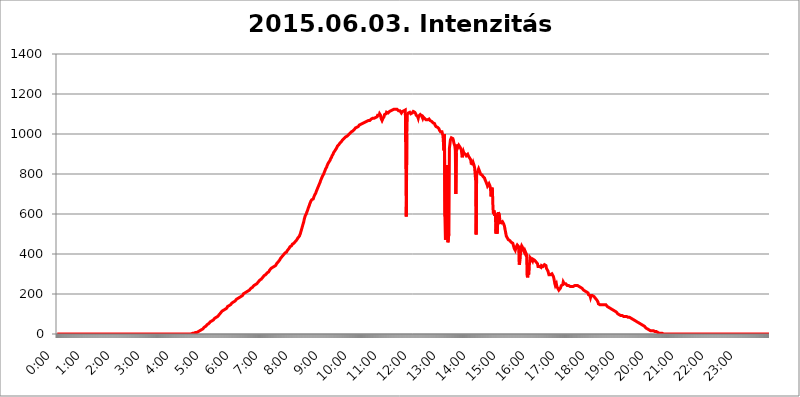
| Category | 2015.06.03. Intenzitás [W/m^2] |
|---|---|
| 0.0 | 0 |
| 0.0006944444444444445 | 0 |
| 0.001388888888888889 | 0 |
| 0.0020833333333333333 | 0 |
| 0.002777777777777778 | 0 |
| 0.003472222222222222 | 0 |
| 0.004166666666666667 | 0 |
| 0.004861111111111111 | 0 |
| 0.005555555555555556 | 0 |
| 0.0062499999999999995 | 0 |
| 0.006944444444444444 | 0 |
| 0.007638888888888889 | 0 |
| 0.008333333333333333 | 0 |
| 0.009027777777777779 | 0 |
| 0.009722222222222222 | 0 |
| 0.010416666666666666 | 0 |
| 0.011111111111111112 | 0 |
| 0.011805555555555555 | 0 |
| 0.012499999999999999 | 0 |
| 0.013194444444444444 | 0 |
| 0.013888888888888888 | 0 |
| 0.014583333333333332 | 0 |
| 0.015277777777777777 | 0 |
| 0.015972222222222224 | 0 |
| 0.016666666666666666 | 0 |
| 0.017361111111111112 | 0 |
| 0.018055555555555557 | 0 |
| 0.01875 | 0 |
| 0.019444444444444445 | 0 |
| 0.02013888888888889 | 0 |
| 0.020833333333333332 | 0 |
| 0.02152777777777778 | 0 |
| 0.022222222222222223 | 0 |
| 0.02291666666666667 | 0 |
| 0.02361111111111111 | 0 |
| 0.024305555555555556 | 0 |
| 0.024999999999999998 | 0 |
| 0.025694444444444447 | 0 |
| 0.02638888888888889 | 0 |
| 0.027083333333333334 | 0 |
| 0.027777777777777776 | 0 |
| 0.02847222222222222 | 0 |
| 0.029166666666666664 | 0 |
| 0.029861111111111113 | 0 |
| 0.030555555555555555 | 0 |
| 0.03125 | 0 |
| 0.03194444444444445 | 0 |
| 0.03263888888888889 | 0 |
| 0.03333333333333333 | 0 |
| 0.034027777777777775 | 0 |
| 0.034722222222222224 | 0 |
| 0.035416666666666666 | 0 |
| 0.036111111111111115 | 0 |
| 0.03680555555555556 | 0 |
| 0.0375 | 0 |
| 0.03819444444444444 | 0 |
| 0.03888888888888889 | 0 |
| 0.03958333333333333 | 0 |
| 0.04027777777777778 | 0 |
| 0.04097222222222222 | 0 |
| 0.041666666666666664 | 0 |
| 0.042361111111111106 | 0 |
| 0.04305555555555556 | 0 |
| 0.043750000000000004 | 0 |
| 0.044444444444444446 | 0 |
| 0.04513888888888889 | 0 |
| 0.04583333333333334 | 0 |
| 0.04652777777777778 | 0 |
| 0.04722222222222222 | 0 |
| 0.04791666666666666 | 0 |
| 0.04861111111111111 | 0 |
| 0.049305555555555554 | 0 |
| 0.049999999999999996 | 0 |
| 0.05069444444444445 | 0 |
| 0.051388888888888894 | 0 |
| 0.052083333333333336 | 0 |
| 0.05277777777777778 | 0 |
| 0.05347222222222222 | 0 |
| 0.05416666666666667 | 0 |
| 0.05486111111111111 | 0 |
| 0.05555555555555555 | 0 |
| 0.05625 | 0 |
| 0.05694444444444444 | 0 |
| 0.057638888888888885 | 0 |
| 0.05833333333333333 | 0 |
| 0.05902777777777778 | 0 |
| 0.059722222222222225 | 0 |
| 0.06041666666666667 | 0 |
| 0.061111111111111116 | 0 |
| 0.06180555555555556 | 0 |
| 0.0625 | 0 |
| 0.06319444444444444 | 0 |
| 0.06388888888888888 | 0 |
| 0.06458333333333334 | 0 |
| 0.06527777777777778 | 0 |
| 0.06597222222222222 | 0 |
| 0.06666666666666667 | 0 |
| 0.06736111111111111 | 0 |
| 0.06805555555555555 | 0 |
| 0.06874999999999999 | 0 |
| 0.06944444444444443 | 0 |
| 0.07013888888888889 | 0 |
| 0.07083333333333333 | 0 |
| 0.07152777777777779 | 0 |
| 0.07222222222222223 | 0 |
| 0.07291666666666667 | 0 |
| 0.07361111111111111 | 0 |
| 0.07430555555555556 | 0 |
| 0.075 | 0 |
| 0.07569444444444444 | 0 |
| 0.0763888888888889 | 0 |
| 0.07708333333333334 | 0 |
| 0.07777777777777778 | 0 |
| 0.07847222222222222 | 0 |
| 0.07916666666666666 | 0 |
| 0.0798611111111111 | 0 |
| 0.08055555555555556 | 0 |
| 0.08125 | 0 |
| 0.08194444444444444 | 0 |
| 0.08263888888888889 | 0 |
| 0.08333333333333333 | 0 |
| 0.08402777777777777 | 0 |
| 0.08472222222222221 | 0 |
| 0.08541666666666665 | 0 |
| 0.08611111111111112 | 0 |
| 0.08680555555555557 | 0 |
| 0.08750000000000001 | 0 |
| 0.08819444444444445 | 0 |
| 0.08888888888888889 | 0 |
| 0.08958333333333333 | 0 |
| 0.09027777777777778 | 0 |
| 0.09097222222222222 | 0 |
| 0.09166666666666667 | 0 |
| 0.09236111111111112 | 0 |
| 0.09305555555555556 | 0 |
| 0.09375 | 0 |
| 0.09444444444444444 | 0 |
| 0.09513888888888888 | 0 |
| 0.09583333333333333 | 0 |
| 0.09652777777777777 | 0 |
| 0.09722222222222222 | 0 |
| 0.09791666666666667 | 0 |
| 0.09861111111111111 | 0 |
| 0.09930555555555555 | 0 |
| 0.09999999999999999 | 0 |
| 0.10069444444444443 | 0 |
| 0.1013888888888889 | 0 |
| 0.10208333333333335 | 0 |
| 0.10277777777777779 | 0 |
| 0.10347222222222223 | 0 |
| 0.10416666666666667 | 0 |
| 0.10486111111111111 | 0 |
| 0.10555555555555556 | 0 |
| 0.10625 | 0 |
| 0.10694444444444444 | 0 |
| 0.1076388888888889 | 0 |
| 0.10833333333333334 | 0 |
| 0.10902777777777778 | 0 |
| 0.10972222222222222 | 0 |
| 0.1111111111111111 | 0 |
| 0.11180555555555556 | 0 |
| 0.11180555555555556 | 0 |
| 0.1125 | 0 |
| 0.11319444444444444 | 0 |
| 0.11388888888888889 | 0 |
| 0.11458333333333333 | 0 |
| 0.11527777777777777 | 0 |
| 0.11597222222222221 | 0 |
| 0.11666666666666665 | 0 |
| 0.1173611111111111 | 0 |
| 0.11805555555555557 | 0 |
| 0.11944444444444445 | 0 |
| 0.12013888888888889 | 0 |
| 0.12083333333333333 | 0 |
| 0.12152777777777778 | 0 |
| 0.12222222222222223 | 0 |
| 0.12291666666666667 | 0 |
| 0.12291666666666667 | 0 |
| 0.12361111111111112 | 0 |
| 0.12430555555555556 | 0 |
| 0.125 | 0 |
| 0.12569444444444444 | 0 |
| 0.12638888888888888 | 0 |
| 0.12708333333333333 | 0 |
| 0.16875 | 0 |
| 0.12847222222222224 | 0 |
| 0.12916666666666668 | 0 |
| 0.12986111111111112 | 0 |
| 0.13055555555555556 | 0 |
| 0.13125 | 0 |
| 0.13194444444444445 | 0 |
| 0.1326388888888889 | 0 |
| 0.13333333333333333 | 0 |
| 0.13402777777777777 | 0 |
| 0.13402777777777777 | 0 |
| 0.13472222222222222 | 0 |
| 0.13541666666666666 | 0 |
| 0.1361111111111111 | 0 |
| 0.13749999999999998 | 0 |
| 0.13819444444444443 | 0 |
| 0.1388888888888889 | 0 |
| 0.13958333333333334 | 0 |
| 0.14027777777777778 | 0 |
| 0.14097222222222222 | 0 |
| 0.14166666666666666 | 0 |
| 0.1423611111111111 | 0 |
| 0.14305555555555557 | 0 |
| 0.14375000000000002 | 0 |
| 0.14444444444444446 | 0 |
| 0.1451388888888889 | 0 |
| 0.1451388888888889 | 0 |
| 0.14652777777777778 | 0 |
| 0.14722222222222223 | 0 |
| 0.14791666666666667 | 0 |
| 0.1486111111111111 | 0 |
| 0.14930555555555555 | 0 |
| 0.15 | 0 |
| 0.15069444444444444 | 0 |
| 0.15138888888888888 | 0 |
| 0.15208333333333332 | 0 |
| 0.15277777777777776 | 0 |
| 0.15347222222222223 | 0 |
| 0.15416666666666667 | 0 |
| 0.15486111111111112 | 0 |
| 0.15555555555555556 | 0 |
| 0.15625 | 0 |
| 0.15694444444444444 | 0 |
| 0.15763888888888888 | 0 |
| 0.15833333333333333 | 0 |
| 0.15902777777777777 | 0 |
| 0.15972222222222224 | 0 |
| 0.16041666666666668 | 0 |
| 0.16111111111111112 | 0 |
| 0.16180555555555556 | 0 |
| 0.1625 | 0 |
| 0.16319444444444445 | 0 |
| 0.1638888888888889 | 0 |
| 0.16458333333333333 | 0 |
| 0.16527777777777777 | 0 |
| 0.16597222222222222 | 0 |
| 0.16666666666666666 | 0 |
| 0.1673611111111111 | 0 |
| 0.16805555555555554 | 0 |
| 0.16874999999999998 | 0 |
| 0.16944444444444443 | 0 |
| 0.17013888888888887 | 0 |
| 0.1708333333333333 | 0 |
| 0.17152777777777775 | 0 |
| 0.17222222222222225 | 0 |
| 0.1729166666666667 | 0 |
| 0.17361111111111113 | 0 |
| 0.17430555555555557 | 0 |
| 0.17500000000000002 | 0 |
| 0.17569444444444446 | 0 |
| 0.1763888888888889 | 0 |
| 0.17708333333333334 | 0 |
| 0.17777777777777778 | 0 |
| 0.17847222222222223 | 0 |
| 0.17916666666666667 | 0 |
| 0.1798611111111111 | 0 |
| 0.18055555555555555 | 0 |
| 0.18125 | 0 |
| 0.18194444444444444 | 0 |
| 0.1826388888888889 | 0 |
| 0.18333333333333335 | 0 |
| 0.1840277777777778 | 0 |
| 0.18472222222222223 | 0 |
| 0.18541666666666667 | 0 |
| 0.18611111111111112 | 0 |
| 0.18680555555555556 | 0 |
| 0.1875 | 0 |
| 0.18819444444444444 | 3.525 |
| 0.18888888888888888 | 3.525 |
| 0.18958333333333333 | 3.525 |
| 0.19027777777777777 | 3.525 |
| 0.1909722222222222 | 3.525 |
| 0.19166666666666665 | 3.525 |
| 0.19236111111111112 | 3.525 |
| 0.19305555555555554 | 3.525 |
| 0.19375 | 7.887 |
| 0.19444444444444445 | 7.887 |
| 0.1951388888888889 | 7.887 |
| 0.19583333333333333 | 7.887 |
| 0.19652777777777777 | 12.257 |
| 0.19722222222222222 | 12.257 |
| 0.19791666666666666 | 12.257 |
| 0.1986111111111111 | 12.257 |
| 0.19930555555555554 | 12.257 |
| 0.19999999999999998 | 16.636 |
| 0.20069444444444443 | 16.636 |
| 0.20138888888888887 | 21.024 |
| 0.2020833333333333 | 21.024 |
| 0.2027777777777778 | 21.024 |
| 0.2034722222222222 | 25.419 |
| 0.2041666666666667 | 25.419 |
| 0.20486111111111113 | 29.823 |
| 0.20555555555555557 | 29.823 |
| 0.20625000000000002 | 34.234 |
| 0.20694444444444446 | 34.234 |
| 0.2076388888888889 | 38.653 |
| 0.20833333333333334 | 38.653 |
| 0.20902777777777778 | 43.079 |
| 0.20972222222222223 | 43.079 |
| 0.21041666666666667 | 47.511 |
| 0.2111111111111111 | 47.511 |
| 0.21180555555555555 | 51.951 |
| 0.2125 | 51.951 |
| 0.21319444444444444 | 56.398 |
| 0.2138888888888889 | 56.398 |
| 0.21458333333333335 | 60.85 |
| 0.2152777777777778 | 60.85 |
| 0.21597222222222223 | 65.31 |
| 0.21666666666666667 | 65.31 |
| 0.21736111111111112 | 65.31 |
| 0.21805555555555556 | 69.775 |
| 0.21875 | 69.775 |
| 0.21944444444444444 | 74.246 |
| 0.22013888888888888 | 74.246 |
| 0.22083333333333333 | 78.722 |
| 0.22152777777777777 | 78.722 |
| 0.2222222222222222 | 83.205 |
| 0.22291666666666665 | 83.205 |
| 0.2236111111111111 | 83.205 |
| 0.22430555555555556 | 87.692 |
| 0.225 | 87.692 |
| 0.22569444444444445 | 92.184 |
| 0.2263888888888889 | 92.184 |
| 0.22708333333333333 | 96.682 |
| 0.22777777777777777 | 101.184 |
| 0.22847222222222222 | 101.184 |
| 0.22916666666666666 | 105.69 |
| 0.2298611111111111 | 110.201 |
| 0.23055555555555554 | 110.201 |
| 0.23124999999999998 | 114.716 |
| 0.23194444444444443 | 114.716 |
| 0.23263888888888887 | 114.716 |
| 0.2333333333333333 | 119.235 |
| 0.2340277777777778 | 119.235 |
| 0.2347222222222222 | 123.758 |
| 0.2354166666666667 | 123.758 |
| 0.23611111111111113 | 128.284 |
| 0.23680555555555557 | 128.284 |
| 0.23750000000000002 | 128.284 |
| 0.23819444444444446 | 132.814 |
| 0.2388888888888889 | 137.347 |
| 0.23958333333333334 | 137.347 |
| 0.24027777777777778 | 137.347 |
| 0.24097222222222223 | 141.884 |
| 0.24166666666666667 | 141.884 |
| 0.2423611111111111 | 146.423 |
| 0.24305555555555555 | 146.423 |
| 0.24375 | 150.964 |
| 0.24444444444444446 | 150.964 |
| 0.24513888888888888 | 155.509 |
| 0.24583333333333335 | 155.509 |
| 0.2465277777777778 | 155.509 |
| 0.24722222222222223 | 160.056 |
| 0.24791666666666667 | 164.605 |
| 0.24861111111111112 | 164.605 |
| 0.24930555555555556 | 164.605 |
| 0.25 | 164.605 |
| 0.25069444444444444 | 169.156 |
| 0.2513888888888889 | 173.709 |
| 0.2520833333333333 | 173.709 |
| 0.25277777777777777 | 173.709 |
| 0.2534722222222222 | 178.264 |
| 0.25416666666666665 | 178.264 |
| 0.2548611111111111 | 182.82 |
| 0.2555555555555556 | 182.82 |
| 0.25625000000000003 | 182.82 |
| 0.2569444444444445 | 187.378 |
| 0.2576388888888889 | 187.378 |
| 0.25833333333333336 | 191.937 |
| 0.2590277777777778 | 191.937 |
| 0.25972222222222224 | 191.937 |
| 0.2604166666666667 | 196.497 |
| 0.2611111111111111 | 201.058 |
| 0.26180555555555557 | 201.058 |
| 0.2625 | 201.058 |
| 0.26319444444444445 | 205.62 |
| 0.2638888888888889 | 205.62 |
| 0.26458333333333334 | 210.182 |
| 0.2652777777777778 | 210.182 |
| 0.2659722222222222 | 214.746 |
| 0.26666666666666666 | 214.746 |
| 0.2673611111111111 | 214.746 |
| 0.26805555555555555 | 219.309 |
| 0.26875 | 219.309 |
| 0.26944444444444443 | 219.309 |
| 0.2701388888888889 | 223.873 |
| 0.2708333333333333 | 223.873 |
| 0.27152777777777776 | 228.436 |
| 0.2722222222222222 | 228.436 |
| 0.27291666666666664 | 233 |
| 0.2736111111111111 | 233 |
| 0.2743055555555555 | 237.564 |
| 0.27499999999999997 | 237.564 |
| 0.27569444444444446 | 242.127 |
| 0.27638888888888885 | 242.127 |
| 0.27708333333333335 | 246.689 |
| 0.2777777777777778 | 246.689 |
| 0.27847222222222223 | 251.251 |
| 0.2791666666666667 | 251.251 |
| 0.2798611111111111 | 251.251 |
| 0.28055555555555556 | 255.813 |
| 0.28125 | 255.813 |
| 0.28194444444444444 | 260.373 |
| 0.2826388888888889 | 260.373 |
| 0.2833333333333333 | 264.932 |
| 0.28402777777777777 | 269.49 |
| 0.2847222222222222 | 269.49 |
| 0.28541666666666665 | 269.49 |
| 0.28611111111111115 | 274.047 |
| 0.28680555555555554 | 274.047 |
| 0.28750000000000003 | 278.603 |
| 0.2881944444444445 | 283.156 |
| 0.2888888888888889 | 283.156 |
| 0.28958333333333336 | 287.709 |
| 0.2902777777777778 | 292.259 |
| 0.29097222222222224 | 292.259 |
| 0.2916666666666667 | 296.808 |
| 0.2923611111111111 | 296.808 |
| 0.29305555555555557 | 296.808 |
| 0.29375 | 301.354 |
| 0.29444444444444445 | 305.898 |
| 0.2951388888888889 | 305.898 |
| 0.29583333333333334 | 310.44 |
| 0.2965277777777778 | 310.44 |
| 0.2972222222222222 | 314.98 |
| 0.29791666666666666 | 319.517 |
| 0.2986111111111111 | 319.517 |
| 0.29930555555555555 | 324.052 |
| 0.3 | 328.584 |
| 0.30069444444444443 | 328.584 |
| 0.3013888888888889 | 328.584 |
| 0.3020833333333333 | 333.113 |
| 0.30277777777777776 | 333.113 |
| 0.3034722222222222 | 337.639 |
| 0.30416666666666664 | 337.639 |
| 0.3048611111111111 | 342.162 |
| 0.3055555555555555 | 342.162 |
| 0.30624999999999997 | 342.162 |
| 0.3069444444444444 | 346.682 |
| 0.3076388888888889 | 351.198 |
| 0.30833333333333335 | 351.198 |
| 0.3090277777777778 | 355.712 |
| 0.30972222222222223 | 360.221 |
| 0.3104166666666667 | 360.221 |
| 0.3111111111111111 | 364.728 |
| 0.31180555555555556 | 369.23 |
| 0.3125 | 373.729 |
| 0.31319444444444444 | 378.224 |
| 0.3138888888888889 | 378.224 |
| 0.3145833333333333 | 382.715 |
| 0.31527777777777777 | 387.202 |
| 0.3159722222222222 | 387.202 |
| 0.31666666666666665 | 391.685 |
| 0.31736111111111115 | 396.164 |
| 0.31805555555555554 | 400.638 |
| 0.31875000000000003 | 400.638 |
| 0.3194444444444445 | 405.108 |
| 0.3201388888888889 | 405.108 |
| 0.32083333333333336 | 409.574 |
| 0.3215277777777778 | 409.574 |
| 0.32222222222222224 | 414.035 |
| 0.3229166666666667 | 418.492 |
| 0.3236111111111111 | 422.943 |
| 0.32430555555555557 | 422.943 |
| 0.325 | 427.39 |
| 0.32569444444444445 | 431.833 |
| 0.3263888888888889 | 436.27 |
| 0.32708333333333334 | 436.27 |
| 0.3277777777777778 | 440.702 |
| 0.3284722222222222 | 440.702 |
| 0.32916666666666666 | 445.129 |
| 0.3298611111111111 | 449.551 |
| 0.33055555555555555 | 449.551 |
| 0.33125 | 449.551 |
| 0.33194444444444443 | 453.968 |
| 0.3326388888888889 | 458.38 |
| 0.3333333333333333 | 458.38 |
| 0.3340277777777778 | 462.786 |
| 0.3347222222222222 | 462.786 |
| 0.3354166666666667 | 467.187 |
| 0.3361111111111111 | 471.582 |
| 0.3368055555555556 | 475.972 |
| 0.33749999999999997 | 480.356 |
| 0.33819444444444446 | 480.356 |
| 0.33888888888888885 | 484.735 |
| 0.33958333333333335 | 489.108 |
| 0.34027777777777773 | 493.475 |
| 0.34097222222222223 | 502.192 |
| 0.3416666666666666 | 510.885 |
| 0.3423611111111111 | 519.555 |
| 0.3430555555555555 | 528.2 |
| 0.34375 | 536.82 |
| 0.3444444444444445 | 545.416 |
| 0.3451388888888889 | 553.986 |
| 0.3458333333333334 | 562.53 |
| 0.34652777777777777 | 575.299 |
| 0.34722222222222227 | 583.779 |
| 0.34791666666666665 | 592.233 |
| 0.34861111111111115 | 596.45 |
| 0.34930555555555554 | 600.661 |
| 0.35000000000000003 | 609.062 |
| 0.3506944444444444 | 613.252 |
| 0.3513888888888889 | 621.613 |
| 0.3520833333333333 | 629.948 |
| 0.3527777777777778 | 634.105 |
| 0.3534722222222222 | 642.4 |
| 0.3541666666666667 | 650.667 |
| 0.3548611111111111 | 654.791 |
| 0.35555555555555557 | 663.019 |
| 0.35625 | 667.123 |
| 0.35694444444444445 | 671.22 |
| 0.3576388888888889 | 675.311 |
| 0.35833333333333334 | 671.22 |
| 0.3590277777777778 | 675.311 |
| 0.3597222222222222 | 683.473 |
| 0.36041666666666666 | 687.544 |
| 0.3611111111111111 | 695.666 |
| 0.36180555555555555 | 699.717 |
| 0.3625 | 703.762 |
| 0.36319444444444443 | 711.832 |
| 0.3638888888888889 | 715.858 |
| 0.3645833333333333 | 723.889 |
| 0.3652777777777778 | 727.896 |
| 0.3659722222222222 | 735.89 |
| 0.3666666666666667 | 739.877 |
| 0.3673611111111111 | 747.834 |
| 0.3680555555555556 | 751.803 |
| 0.36874999999999997 | 759.723 |
| 0.36944444444444446 | 767.62 |
| 0.37013888888888885 | 771.559 |
| 0.37083333333333335 | 779.42 |
| 0.37152777777777773 | 783.342 |
| 0.37222222222222223 | 791.169 |
| 0.3729166666666666 | 795.074 |
| 0.3736111111111111 | 798.974 |
| 0.3743055555555555 | 806.757 |
| 0.375 | 810.641 |
| 0.3756944444444445 | 818.392 |
| 0.3763888888888889 | 826.123 |
| 0.3770833333333334 | 829.981 |
| 0.37777777777777777 | 833.834 |
| 0.37847222222222227 | 841.526 |
| 0.37916666666666665 | 845.365 |
| 0.37986111111111115 | 853.029 |
| 0.38055555555555554 | 856.855 |
| 0.38125000000000003 | 860.676 |
| 0.3819444444444444 | 864.493 |
| 0.3826388888888889 | 868.305 |
| 0.3833333333333333 | 875.918 |
| 0.3840277777777778 | 879.719 |
| 0.3847222222222222 | 883.516 |
| 0.3854166666666667 | 891.099 |
| 0.3861111111111111 | 894.885 |
| 0.38680555555555557 | 898.668 |
| 0.3875 | 906.223 |
| 0.38819444444444445 | 909.996 |
| 0.3888888888888889 | 913.766 |
| 0.38958333333333334 | 917.534 |
| 0.3902777777777778 | 921.298 |
| 0.3909722222222222 | 925.06 |
| 0.39166666666666666 | 928.819 |
| 0.3923611111111111 | 932.576 |
| 0.39305555555555555 | 940.082 |
| 0.39375 | 940.082 |
| 0.39444444444444443 | 943.832 |
| 0.3951388888888889 | 947.58 |
| 0.3958333333333333 | 951.327 |
| 0.3965277777777778 | 955.071 |
| 0.3972222222222222 | 958.814 |
| 0.3979166666666667 | 958.814 |
| 0.3986111111111111 | 962.555 |
| 0.3993055555555556 | 966.295 |
| 0.39999999999999997 | 970.034 |
| 0.40069444444444446 | 970.034 |
| 0.40138888888888885 | 973.772 |
| 0.40208333333333335 | 977.508 |
| 0.40277777777777773 | 981.244 |
| 0.40347222222222223 | 981.244 |
| 0.4041666666666666 | 984.98 |
| 0.4048611111111111 | 984.98 |
| 0.4055555555555555 | 988.714 |
| 0.40625 | 988.714 |
| 0.4069444444444445 | 992.448 |
| 0.4076388888888889 | 992.448 |
| 0.4083333333333334 | 996.182 |
| 0.40902777777777777 | 996.182 |
| 0.40972222222222227 | 999.916 |
| 0.41041666666666665 | 1003.65 |
| 0.41111111111111115 | 1003.65 |
| 0.41180555555555554 | 1007.383 |
| 0.41250000000000003 | 1011.118 |
| 0.4131944444444444 | 1011.118 |
| 0.4138888888888889 | 1011.118 |
| 0.4145833333333333 | 1014.852 |
| 0.4152777777777778 | 1014.852 |
| 0.4159722222222222 | 1018.587 |
| 0.4166666666666667 | 1022.323 |
| 0.4173611111111111 | 1026.06 |
| 0.41805555555555557 | 1029.798 |
| 0.41875 | 1029.798 |
| 0.41944444444444445 | 1029.798 |
| 0.4201388888888889 | 1033.537 |
| 0.42083333333333334 | 1037.277 |
| 0.4215277777777778 | 1037.277 |
| 0.4222222222222222 | 1037.277 |
| 0.42291666666666666 | 1037.277 |
| 0.4236111111111111 | 1044.762 |
| 0.42430555555555555 | 1044.762 |
| 0.425 | 1044.762 |
| 0.42569444444444443 | 1048.508 |
| 0.4263888888888889 | 1048.508 |
| 0.4270833333333333 | 1052.255 |
| 0.4277777777777778 | 1052.255 |
| 0.4284722222222222 | 1052.255 |
| 0.4291666666666667 | 1052.255 |
| 0.4298611111111111 | 1056.004 |
| 0.4305555555555556 | 1056.004 |
| 0.43124999999999997 | 1059.756 |
| 0.43194444444444446 | 1059.756 |
| 0.43263888888888885 | 1063.51 |
| 0.43333333333333335 | 1063.51 |
| 0.43402777777777773 | 1063.51 |
| 0.43472222222222223 | 1067.267 |
| 0.4354166666666666 | 1067.267 |
| 0.4361111111111111 | 1067.267 |
| 0.4368055555555555 | 1067.267 |
| 0.4375 | 1067.267 |
| 0.4381944444444445 | 1067.267 |
| 0.4388888888888889 | 1071.027 |
| 0.4395833333333334 | 1071.027 |
| 0.44027777777777777 | 1074.789 |
| 0.44097222222222227 | 1074.789 |
| 0.44166666666666665 | 1078.555 |
| 0.44236111111111115 | 1078.555 |
| 0.44305555555555554 | 1078.555 |
| 0.44375000000000003 | 1078.555 |
| 0.4444444444444444 | 1078.555 |
| 0.4451388888888889 | 1078.555 |
| 0.4458333333333333 | 1082.324 |
| 0.4465277777777778 | 1082.324 |
| 0.4472222222222222 | 1082.324 |
| 0.4479166666666667 | 1086.097 |
| 0.4486111111111111 | 1086.097 |
| 0.44930555555555557 | 1093.653 |
| 0.45 | 1093.653 |
| 0.45069444444444445 | 1089.873 |
| 0.4513888888888889 | 1093.653 |
| 0.45208333333333334 | 1101.226 |
| 0.4527777777777778 | 1101.226 |
| 0.4534722222222222 | 1093.653 |
| 0.45416666666666666 | 1078.555 |
| 0.4548611111111111 | 1074.789 |
| 0.45555555555555555 | 1067.267 |
| 0.45625 | 1067.267 |
| 0.45694444444444443 | 1078.555 |
| 0.4576388888888889 | 1078.555 |
| 0.4583333333333333 | 1086.097 |
| 0.4590277777777778 | 1097.437 |
| 0.4597222222222222 | 1097.437 |
| 0.4604166666666667 | 1097.437 |
| 0.4611111111111111 | 1101.226 |
| 0.4618055555555556 | 1108.816 |
| 0.46249999999999997 | 1108.816 |
| 0.46319444444444446 | 1105.019 |
| 0.46388888888888885 | 1105.019 |
| 0.46458333333333335 | 1105.019 |
| 0.46527777777777773 | 1108.816 |
| 0.46597222222222223 | 1112.618 |
| 0.4666666666666666 | 1116.426 |
| 0.4673611111111111 | 1116.426 |
| 0.4680555555555555 | 1116.426 |
| 0.46875 | 1120.238 |
| 0.4694444444444445 | 1120.238 |
| 0.4701388888888889 | 1120.238 |
| 0.4708333333333334 | 1120.238 |
| 0.47152777777777777 | 1120.238 |
| 0.47222222222222227 | 1124.056 |
| 0.47291666666666665 | 1124.056 |
| 0.47361111111111115 | 1124.056 |
| 0.47430555555555554 | 1124.056 |
| 0.47500000000000003 | 1124.056 |
| 0.4756944444444444 | 1124.056 |
| 0.4763888888888889 | 1124.056 |
| 0.4770833333333333 | 1124.056 |
| 0.4777777777777778 | 1124.056 |
| 0.4784722222222222 | 1116.426 |
| 0.4791666666666667 | 1116.426 |
| 0.4798611111111111 | 1116.426 |
| 0.48055555555555557 | 1116.426 |
| 0.48125 | 1120.238 |
| 0.48194444444444445 | 1116.426 |
| 0.4826388888888889 | 1105.019 |
| 0.48333333333333334 | 1108.816 |
| 0.4840277777777778 | 1112.618 |
| 0.4847222222222222 | 1108.816 |
| 0.48541666666666666 | 1112.618 |
| 0.4861111111111111 | 1116.426 |
| 0.48680555555555555 | 1116.426 |
| 0.4875 | 1116.426 |
| 0.48819444444444443 | 1120.238 |
| 0.4888888888888889 | 1116.426 |
| 0.4895833333333333 | 588.009 |
| 0.4902777777777778 | 999.916 |
| 0.4909722222222222 | 1097.437 |
| 0.4916666666666667 | 1097.437 |
| 0.4923611111111111 | 1105.019 |
| 0.4930555555555556 | 1101.226 |
| 0.49374999999999997 | 1105.019 |
| 0.49444444444444446 | 1108.816 |
| 0.49513888888888885 | 1108.816 |
| 0.49583333333333335 | 1101.226 |
| 0.49652777777777773 | 1105.019 |
| 0.49722222222222223 | 1105.019 |
| 0.4979166666666666 | 1105.019 |
| 0.4986111111111111 | 1108.816 |
| 0.4993055555555555 | 1112.618 |
| 0.5 | 1108.816 |
| 0.5006944444444444 | 1108.816 |
| 0.5013888888888889 | 1108.816 |
| 0.5020833333333333 | 1105.019 |
| 0.5027777777777778 | 1101.226 |
| 0.5034722222222222 | 1093.653 |
| 0.5041666666666667 | 1089.873 |
| 0.5048611111111111 | 1097.437 |
| 0.5055555555555555 | 1086.097 |
| 0.50625 | 1078.555 |
| 0.5069444444444444 | 1089.873 |
| 0.5076388888888889 | 1089.873 |
| 0.5083333333333333 | 1089.873 |
| 0.5090277777777777 | 1097.437 |
| 0.5097222222222222 | 1101.226 |
| 0.5104166666666666 | 1097.437 |
| 0.5111111111111112 | 1089.873 |
| 0.5118055555555555 | 1086.097 |
| 0.5125000000000001 | 1078.555 |
| 0.5131944444444444 | 1086.097 |
| 0.513888888888889 | 1089.873 |
| 0.5145833333333333 | 1086.097 |
| 0.5152777777777778 | 1078.555 |
| 0.5159722222222222 | 1074.789 |
| 0.5166666666666667 | 1074.789 |
| 0.517361111111111 | 1071.027 |
| 0.5180555555555556 | 1067.267 |
| 0.5187499999999999 | 1067.267 |
| 0.5194444444444445 | 1071.027 |
| 0.5201388888888888 | 1074.789 |
| 0.5208333333333334 | 1074.789 |
| 0.5215277777777778 | 1074.789 |
| 0.5222222222222223 | 1074.789 |
| 0.5229166666666667 | 1067.267 |
| 0.5236111111111111 | 1067.267 |
| 0.5243055555555556 | 1063.51 |
| 0.525 | 1063.51 |
| 0.5256944444444445 | 1059.756 |
| 0.5263888888888889 | 1059.756 |
| 0.5270833333333333 | 1056.004 |
| 0.5277777777777778 | 1059.756 |
| 0.5284722222222222 | 1059.756 |
| 0.5291666666666667 | 1052.255 |
| 0.5298611111111111 | 1044.762 |
| 0.5305555555555556 | 1041.019 |
| 0.53125 | 1037.277 |
| 0.5319444444444444 | 1037.277 |
| 0.5326388888888889 | 1033.537 |
| 0.5333333333333333 | 1033.537 |
| 0.5340277777777778 | 1029.798 |
| 0.5347222222222222 | 1029.798 |
| 0.5354166666666667 | 1026.06 |
| 0.5361111111111111 | 1018.587 |
| 0.5368055555555555 | 1022.323 |
| 0.5375 | 1011.118 |
| 0.5381944444444444 | 1014.852 |
| 0.5388888888888889 | 1007.383 |
| 0.5395833333333333 | 1011.118 |
| 0.5402777777777777 | 999.916 |
| 0.5409722222222222 | 992.448 |
| 0.5416666666666666 | 992.448 |
| 0.5423611111111112 | 917.534 |
| 0.5430555555555555 | 999.916 |
| 0.5437500000000001 | 588.009 |
| 0.5444444444444444 | 471.582 |
| 0.545138888888889 | 502.192 |
| 0.5458333333333333 | 845.365 |
| 0.5465277777777778 | 650.667 |
| 0.5472222222222222 | 575.299 |
| 0.5479166666666667 | 458.38 |
| 0.548611111111111 | 462.786 |
| 0.5493055555555556 | 502.192 |
| 0.5499999999999999 | 928.819 |
| 0.5506944444444445 | 947.58 |
| 0.5513888888888888 | 970.034 |
| 0.5520833333333334 | 973.772 |
| 0.5527777777777778 | 981.244 |
| 0.5534722222222223 | 984.98 |
| 0.5541666666666667 | 977.508 |
| 0.5548611111111111 | 977.508 |
| 0.5555555555555556 | 970.034 |
| 0.55625 | 955.071 |
| 0.5569444444444445 | 951.327 |
| 0.5576388888888889 | 940.082 |
| 0.5583333333333333 | 917.534 |
| 0.5590277777777778 | 699.717 |
| 0.5597222222222222 | 906.223 |
| 0.5604166666666667 | 947.58 |
| 0.5611111111111111 | 943.832 |
| 0.5618055555555556 | 932.576 |
| 0.5625 | 936.33 |
| 0.5631944444444444 | 943.832 |
| 0.5638888888888889 | 940.082 |
| 0.5645833333333333 | 936.33 |
| 0.5652777777777778 | 932.576 |
| 0.5659722222222222 | 932.576 |
| 0.5666666666666667 | 921.298 |
| 0.5673611111111111 | 902.447 |
| 0.5680555555555555 | 883.516 |
| 0.56875 | 906.223 |
| 0.5694444444444444 | 913.766 |
| 0.5701388888888889 | 906.223 |
| 0.5708333333333333 | 906.223 |
| 0.5715277777777777 | 902.447 |
| 0.5722222222222222 | 898.668 |
| 0.5729166666666666 | 894.885 |
| 0.5736111111111112 | 891.099 |
| 0.5743055555555555 | 891.099 |
| 0.5750000000000001 | 887.309 |
| 0.5756944444444444 | 898.668 |
| 0.576388888888889 | 894.885 |
| 0.5770833333333333 | 887.309 |
| 0.5777777777777778 | 883.516 |
| 0.5784722222222222 | 879.719 |
| 0.5791666666666667 | 883.516 |
| 0.579861111111111 | 872.114 |
| 0.5805555555555556 | 853.029 |
| 0.5812499999999999 | 853.029 |
| 0.5819444444444445 | 853.029 |
| 0.5826388888888888 | 849.199 |
| 0.5833333333333334 | 856.855 |
| 0.5840277777777778 | 849.199 |
| 0.5847222222222223 | 841.526 |
| 0.5854166666666667 | 829.981 |
| 0.5861111111111111 | 826.123 |
| 0.5868055555555556 | 767.62 |
| 0.5875 | 497.836 |
| 0.5881944444444445 | 814.519 |
| 0.5888888888888889 | 806.757 |
| 0.5895833333333333 | 810.641 |
| 0.5902777777777778 | 806.757 |
| 0.5909722222222222 | 826.123 |
| 0.5916666666666667 | 826.123 |
| 0.5923611111111111 | 822.26 |
| 0.5930555555555556 | 806.757 |
| 0.59375 | 798.974 |
| 0.5944444444444444 | 798.974 |
| 0.5951388888888889 | 795.074 |
| 0.5958333333333333 | 795.074 |
| 0.5965277777777778 | 791.169 |
| 0.5972222222222222 | 787.258 |
| 0.5979166666666667 | 787.258 |
| 0.5986111111111111 | 787.258 |
| 0.5993055555555555 | 779.42 |
| 0.6 | 771.559 |
| 0.6006944444444444 | 767.62 |
| 0.6013888888888889 | 759.723 |
| 0.6020833333333333 | 755.766 |
| 0.6027777777777777 | 747.834 |
| 0.6034722222222222 | 739.877 |
| 0.6041666666666666 | 735.89 |
| 0.6048611111111112 | 743.859 |
| 0.6055555555555555 | 751.803 |
| 0.6062500000000001 | 751.803 |
| 0.6069444444444444 | 739.877 |
| 0.607638888888889 | 727.896 |
| 0.6083333333333333 | 687.544 |
| 0.6090277777777778 | 699.717 |
| 0.6097222222222222 | 731.896 |
| 0.6104166666666667 | 715.858 |
| 0.611111111111111 | 629.948 |
| 0.6118055555555556 | 600.661 |
| 0.6124999999999999 | 617.436 |
| 0.6131944444444445 | 592.233 |
| 0.6138888888888888 | 604.864 |
| 0.6145833333333334 | 592.233 |
| 0.6152777777777778 | 502.192 |
| 0.6159722222222223 | 558.261 |
| 0.6166666666666667 | 502.192 |
| 0.6173611111111111 | 519.555 |
| 0.6180555555555556 | 579.542 |
| 0.61875 | 609.062 |
| 0.6194444444444445 | 609.062 |
| 0.6201388888888889 | 592.233 |
| 0.6208333333333333 | 566.793 |
| 0.6215277777777778 | 549.704 |
| 0.6222222222222222 | 558.261 |
| 0.6229166666666667 | 558.261 |
| 0.6236111111111111 | 558.261 |
| 0.6243055555555556 | 562.53 |
| 0.625 | 558.261 |
| 0.6256944444444444 | 553.986 |
| 0.6263888888888889 | 549.704 |
| 0.6270833333333333 | 541.121 |
| 0.6277777777777778 | 528.2 |
| 0.6284722222222222 | 515.223 |
| 0.6291666666666667 | 502.192 |
| 0.6298611111111111 | 489.108 |
| 0.6305555555555555 | 484.735 |
| 0.63125 | 480.356 |
| 0.6319444444444444 | 475.972 |
| 0.6326388888888889 | 471.582 |
| 0.6333333333333333 | 471.582 |
| 0.6340277777777777 | 471.582 |
| 0.6347222222222222 | 467.187 |
| 0.6354166666666666 | 467.187 |
| 0.6361111111111112 | 462.786 |
| 0.6368055555555555 | 458.38 |
| 0.6375000000000001 | 458.38 |
| 0.6381944444444444 | 458.38 |
| 0.638888888888889 | 453.968 |
| 0.6395833333333333 | 445.129 |
| 0.6402777777777778 | 436.27 |
| 0.6409722222222222 | 427.39 |
| 0.6416666666666667 | 427.39 |
| 0.642361111111111 | 418.492 |
| 0.6430555555555556 | 427.39 |
| 0.6437499999999999 | 436.27 |
| 0.6444444444444445 | 440.702 |
| 0.6451388888888888 | 445.129 |
| 0.6458333333333334 | 449.551 |
| 0.6465277777777778 | 449.551 |
| 0.6472222222222223 | 436.27 |
| 0.6479166666666667 | 346.682 |
| 0.6486111111111111 | 355.712 |
| 0.6493055555555556 | 378.224 |
| 0.65 | 422.943 |
| 0.6506944444444445 | 427.39 |
| 0.6513888888888889 | 440.702 |
| 0.6520833333333333 | 440.702 |
| 0.6527777777777778 | 436.27 |
| 0.6534722222222222 | 427.39 |
| 0.6541666666666667 | 414.035 |
| 0.6548611111111111 | 418.492 |
| 0.6555555555555556 | 405.108 |
| 0.65625 | 414.035 |
| 0.6569444444444444 | 409.574 |
| 0.6576388888888889 | 409.574 |
| 0.6583333333333333 | 396.164 |
| 0.6590277777777778 | 292.259 |
| 0.6597222222222222 | 283.156 |
| 0.6604166666666667 | 333.113 |
| 0.6611111111111111 | 296.808 |
| 0.6618055555555555 | 337.639 |
| 0.6625 | 355.712 |
| 0.6631944444444444 | 382.715 |
| 0.6638888888888889 | 387.202 |
| 0.6645833333333333 | 378.224 |
| 0.6652777777777777 | 373.729 |
| 0.6659722222222222 | 369.23 |
| 0.6666666666666666 | 364.728 |
| 0.6673611111111111 | 373.729 |
| 0.6680555555555556 | 369.23 |
| 0.6687500000000001 | 369.23 |
| 0.6694444444444444 | 369.23 |
| 0.6701388888888888 | 369.23 |
| 0.6708333333333334 | 364.728 |
| 0.6715277777777778 | 360.221 |
| 0.6722222222222222 | 355.712 |
| 0.6729166666666666 | 355.712 |
| 0.6736111111111112 | 351.198 |
| 0.6743055555555556 | 337.639 |
| 0.6749999999999999 | 342.162 |
| 0.6756944444444444 | 333.113 |
| 0.6763888888888889 | 337.639 |
| 0.6770833333333334 | 337.639 |
| 0.6777777777777777 | 342.162 |
| 0.6784722222222223 | 333.113 |
| 0.6791666666666667 | 342.162 |
| 0.6798611111111111 | 346.682 |
| 0.6805555555555555 | 342.162 |
| 0.68125 | 337.639 |
| 0.6819444444444445 | 333.113 |
| 0.6826388888888889 | 333.113 |
| 0.6833333333333332 | 346.682 |
| 0.6840277777777778 | 342.162 |
| 0.6847222222222222 | 342.162 |
| 0.6854166666666667 | 342.162 |
| 0.686111111111111 | 328.584 |
| 0.6868055555555556 | 324.052 |
| 0.6875 | 328.584 |
| 0.6881944444444444 | 314.98 |
| 0.688888888888889 | 314.98 |
| 0.6895833333333333 | 296.808 |
| 0.6902777777777778 | 296.808 |
| 0.6909722222222222 | 292.259 |
| 0.6916666666666668 | 296.808 |
| 0.6923611111111111 | 296.808 |
| 0.6930555555555555 | 296.808 |
| 0.69375 | 301.354 |
| 0.6944444444444445 | 305.898 |
| 0.6951388888888889 | 301.354 |
| 0.6958333333333333 | 287.709 |
| 0.6965277777777777 | 278.603 |
| 0.6972222222222223 | 278.603 |
| 0.6979166666666666 | 251.251 |
| 0.6986111111111111 | 242.127 |
| 0.6993055555555556 | 237.564 |
| 0.7000000000000001 | 251.251 |
| 0.7006944444444444 | 237.564 |
| 0.7013888888888888 | 233 |
| 0.7020833333333334 | 228.436 |
| 0.7027777777777778 | 228.436 |
| 0.7034722222222222 | 219.309 |
| 0.7041666666666666 | 223.873 |
| 0.7048611111111112 | 223.873 |
| 0.7055555555555556 | 228.436 |
| 0.7062499999999999 | 233 |
| 0.7069444444444444 | 242.127 |
| 0.7076388888888889 | 246.689 |
| 0.7083333333333334 | 242.127 |
| 0.7090277777777777 | 246.689 |
| 0.7097222222222223 | 260.373 |
| 0.7104166666666667 | 260.373 |
| 0.7111111111111111 | 251.251 |
| 0.7118055555555555 | 251.251 |
| 0.7125 | 251.251 |
| 0.7131944444444445 | 251.251 |
| 0.7138888888888889 | 255.813 |
| 0.7145833333333332 | 246.689 |
| 0.7152777777777778 | 242.127 |
| 0.7159722222222222 | 242.127 |
| 0.7166666666666667 | 242.127 |
| 0.717361111111111 | 242.127 |
| 0.7180555555555556 | 242.127 |
| 0.71875 | 237.564 |
| 0.7194444444444444 | 237.564 |
| 0.720138888888889 | 233 |
| 0.7208333333333333 | 237.564 |
| 0.7215277777777778 | 237.564 |
| 0.7222222222222222 | 237.564 |
| 0.7229166666666668 | 237.564 |
| 0.7236111111111111 | 237.564 |
| 0.7243055555555555 | 237.564 |
| 0.725 | 242.127 |
| 0.7256944444444445 | 242.127 |
| 0.7263888888888889 | 242.127 |
| 0.7270833333333333 | 242.127 |
| 0.7277777777777777 | 242.127 |
| 0.7284722222222223 | 242.127 |
| 0.7291666666666666 | 242.127 |
| 0.7298611111111111 | 242.127 |
| 0.7305555555555556 | 242.127 |
| 0.7312500000000001 | 237.564 |
| 0.7319444444444444 | 237.564 |
| 0.7326388888888888 | 233 |
| 0.7333333333333334 | 233 |
| 0.7340277777777778 | 233 |
| 0.7347222222222222 | 233 |
| 0.7354166666666666 | 228.436 |
| 0.7361111111111112 | 228.436 |
| 0.7368055555555556 | 223.873 |
| 0.7374999999999999 | 223.873 |
| 0.7381944444444444 | 219.309 |
| 0.7388888888888889 | 219.309 |
| 0.7395833333333334 | 219.309 |
| 0.7402777777777777 | 214.746 |
| 0.7409722222222223 | 214.746 |
| 0.7416666666666667 | 214.746 |
| 0.7423611111111111 | 210.182 |
| 0.7430555555555555 | 210.182 |
| 0.74375 | 210.182 |
| 0.7444444444444445 | 205.62 |
| 0.7451388888888889 | 196.497 |
| 0.7458333333333332 | 196.497 |
| 0.7465277777777778 | 191.937 |
| 0.7472222222222222 | 191.937 |
| 0.7479166666666667 | 182.82 |
| 0.748611111111111 | 191.937 |
| 0.7493055555555556 | 191.937 |
| 0.75 | 191.937 |
| 0.7506944444444444 | 191.937 |
| 0.751388888888889 | 187.378 |
| 0.7520833333333333 | 187.378 |
| 0.7527777777777778 | 187.378 |
| 0.7534722222222222 | 182.82 |
| 0.7541666666666668 | 182.82 |
| 0.7548611111111111 | 178.264 |
| 0.7555555555555555 | 178.264 |
| 0.75625 | 173.709 |
| 0.7569444444444445 | 169.156 |
| 0.7576388888888889 | 164.605 |
| 0.7583333333333333 | 160.056 |
| 0.7590277777777777 | 150.964 |
| 0.7597222222222223 | 150.964 |
| 0.7604166666666666 | 146.423 |
| 0.7611111111111111 | 146.423 |
| 0.7618055555555556 | 146.423 |
| 0.7625000000000001 | 150.964 |
| 0.7631944444444444 | 146.423 |
| 0.7638888888888888 | 146.423 |
| 0.7645833333333334 | 146.423 |
| 0.7652777777777778 | 146.423 |
| 0.7659722222222222 | 146.423 |
| 0.7666666666666666 | 146.423 |
| 0.7673611111111112 | 146.423 |
| 0.7680555555555556 | 146.423 |
| 0.7687499999999999 | 146.423 |
| 0.7694444444444444 | 146.423 |
| 0.7701388888888889 | 141.884 |
| 0.7708333333333334 | 141.884 |
| 0.7715277777777777 | 137.347 |
| 0.7722222222222223 | 137.347 |
| 0.7729166666666667 | 137.347 |
| 0.7736111111111111 | 132.814 |
| 0.7743055555555555 | 132.814 |
| 0.775 | 128.284 |
| 0.7756944444444445 | 128.284 |
| 0.7763888888888889 | 128.284 |
| 0.7770833333333332 | 123.758 |
| 0.7777777777777778 | 123.758 |
| 0.7784722222222222 | 123.758 |
| 0.7791666666666667 | 119.235 |
| 0.779861111111111 | 119.235 |
| 0.7805555555555556 | 119.235 |
| 0.78125 | 119.235 |
| 0.7819444444444444 | 114.716 |
| 0.782638888888889 | 114.716 |
| 0.7833333333333333 | 110.201 |
| 0.7840277777777778 | 110.201 |
| 0.7847222222222222 | 105.69 |
| 0.7854166666666668 | 105.69 |
| 0.7861111111111111 | 101.184 |
| 0.7868055555555555 | 101.184 |
| 0.7875 | 96.682 |
| 0.7881944444444445 | 96.682 |
| 0.7888888888888889 | 92.184 |
| 0.7895833333333333 | 92.184 |
| 0.7902777777777777 | 92.184 |
| 0.7909722222222223 | 87.692 |
| 0.7916666666666666 | 87.692 |
| 0.7923611111111111 | 92.184 |
| 0.7930555555555556 | 92.184 |
| 0.7937500000000001 | 87.692 |
| 0.7944444444444444 | 87.692 |
| 0.7951388888888888 | 87.692 |
| 0.7958333333333334 | 87.692 |
| 0.7965277777777778 | 87.692 |
| 0.7972222222222222 | 87.692 |
| 0.7979166666666666 | 87.692 |
| 0.7986111111111112 | 87.692 |
| 0.7993055555555556 | 87.692 |
| 0.7999999999999999 | 83.205 |
| 0.8006944444444444 | 83.205 |
| 0.8013888888888889 | 83.205 |
| 0.8020833333333334 | 83.205 |
| 0.8027777777777777 | 83.205 |
| 0.8034722222222223 | 83.205 |
| 0.8041666666666667 | 78.722 |
| 0.8048611111111111 | 78.722 |
| 0.8055555555555555 | 74.246 |
| 0.80625 | 74.246 |
| 0.8069444444444445 | 74.246 |
| 0.8076388888888889 | 74.246 |
| 0.8083333333333332 | 69.775 |
| 0.8090277777777778 | 69.775 |
| 0.8097222222222222 | 69.775 |
| 0.8104166666666667 | 65.31 |
| 0.811111111111111 | 65.31 |
| 0.8118055555555556 | 65.31 |
| 0.8125 | 65.31 |
| 0.8131944444444444 | 60.85 |
| 0.813888888888889 | 60.85 |
| 0.8145833333333333 | 56.398 |
| 0.8152777777777778 | 56.398 |
| 0.8159722222222222 | 56.398 |
| 0.8166666666666668 | 56.398 |
| 0.8173611111111111 | 51.951 |
| 0.8180555555555555 | 51.951 |
| 0.81875 | 51.951 |
| 0.8194444444444445 | 47.511 |
| 0.8201388888888889 | 47.511 |
| 0.8208333333333333 | 47.511 |
| 0.8215277777777777 | 43.079 |
| 0.8222222222222223 | 43.079 |
| 0.8229166666666666 | 38.653 |
| 0.8236111111111111 | 38.653 |
| 0.8243055555555556 | 38.653 |
| 0.8250000000000001 | 34.234 |
| 0.8256944444444444 | 29.823 |
| 0.8263888888888888 | 29.823 |
| 0.8270833333333334 | 29.823 |
| 0.8277777777777778 | 25.419 |
| 0.8284722222222222 | 25.419 |
| 0.8291666666666666 | 21.024 |
| 0.8298611111111112 | 21.024 |
| 0.8305555555555556 | 21.024 |
| 0.8312499999999999 | 21.024 |
| 0.8319444444444444 | 16.636 |
| 0.8326388888888889 | 16.636 |
| 0.8333333333333334 | 16.636 |
| 0.8340277777777777 | 16.636 |
| 0.8347222222222223 | 16.636 |
| 0.8354166666666667 | 16.636 |
| 0.8361111111111111 | 16.636 |
| 0.8368055555555555 | 16.636 |
| 0.8375 | 12.257 |
| 0.8381944444444445 | 12.257 |
| 0.8388888888888889 | 12.257 |
| 0.8395833333333332 | 12.257 |
| 0.8402777777777778 | 12.257 |
| 0.8409722222222222 | 12.257 |
| 0.8416666666666667 | 12.257 |
| 0.842361111111111 | 7.887 |
| 0.8430555555555556 | 7.887 |
| 0.84375 | 7.887 |
| 0.8444444444444444 | 3.525 |
| 0.845138888888889 | 3.525 |
| 0.8458333333333333 | 3.525 |
| 0.8465277777777778 | 3.525 |
| 0.8472222222222222 | 3.525 |
| 0.8479166666666668 | 3.525 |
| 0.8486111111111111 | 3.525 |
| 0.8493055555555555 | 3.525 |
| 0.85 | 3.525 |
| 0.8506944444444445 | 0 |
| 0.8513888888888889 | 0 |
| 0.8520833333333333 | 0 |
| 0.8527777777777777 | 0 |
| 0.8534722222222223 | 0 |
| 0.8541666666666666 | 0 |
| 0.8548611111111111 | 0 |
| 0.8555555555555556 | 0 |
| 0.8562500000000001 | 0 |
| 0.8569444444444444 | 0 |
| 0.8576388888888888 | 0 |
| 0.8583333333333334 | 0 |
| 0.8590277777777778 | 0 |
| 0.8597222222222222 | 0 |
| 0.8604166666666666 | 0 |
| 0.8611111111111112 | 0 |
| 0.8618055555555556 | 0 |
| 0.8624999999999999 | 0 |
| 0.8631944444444444 | 0 |
| 0.8638888888888889 | 0 |
| 0.8645833333333334 | 0 |
| 0.8652777777777777 | 0 |
| 0.8659722222222223 | 0 |
| 0.8666666666666667 | 0 |
| 0.8673611111111111 | 0 |
| 0.8680555555555555 | 0 |
| 0.86875 | 0 |
| 0.8694444444444445 | 0 |
| 0.8701388888888889 | 0 |
| 0.8708333333333332 | 0 |
| 0.8715277777777778 | 0 |
| 0.8722222222222222 | 0 |
| 0.8729166666666667 | 0 |
| 0.873611111111111 | 0 |
| 0.8743055555555556 | 0 |
| 0.875 | 0 |
| 0.8756944444444444 | 0 |
| 0.876388888888889 | 0 |
| 0.8770833333333333 | 0 |
| 0.8777777777777778 | 0 |
| 0.8784722222222222 | 0 |
| 0.8791666666666668 | 0 |
| 0.8798611111111111 | 0 |
| 0.8805555555555555 | 0 |
| 0.88125 | 0 |
| 0.8819444444444445 | 0 |
| 0.8826388888888889 | 0 |
| 0.8833333333333333 | 0 |
| 0.8840277777777777 | 0 |
| 0.8847222222222223 | 0 |
| 0.8854166666666666 | 0 |
| 0.8861111111111111 | 0 |
| 0.8868055555555556 | 0 |
| 0.8875000000000001 | 0 |
| 0.8881944444444444 | 0 |
| 0.8888888888888888 | 0 |
| 0.8895833333333334 | 0 |
| 0.8902777777777778 | 0 |
| 0.8909722222222222 | 0 |
| 0.8916666666666666 | 0 |
| 0.8923611111111112 | 0 |
| 0.8930555555555556 | 0 |
| 0.8937499999999999 | 0 |
| 0.8944444444444444 | 0 |
| 0.8951388888888889 | 0 |
| 0.8958333333333334 | 0 |
| 0.8965277777777777 | 0 |
| 0.8972222222222223 | 0 |
| 0.8979166666666667 | 0 |
| 0.8986111111111111 | 0 |
| 0.8993055555555555 | 0 |
| 0.9 | 0 |
| 0.9006944444444445 | 0 |
| 0.9013888888888889 | 0 |
| 0.9020833333333332 | 0 |
| 0.9027777777777778 | 0 |
| 0.9034722222222222 | 0 |
| 0.9041666666666667 | 0 |
| 0.904861111111111 | 0 |
| 0.9055555555555556 | 0 |
| 0.90625 | 0 |
| 0.9069444444444444 | 0 |
| 0.907638888888889 | 0 |
| 0.9083333333333333 | 0 |
| 0.9090277777777778 | 0 |
| 0.9097222222222222 | 0 |
| 0.9104166666666668 | 0 |
| 0.9111111111111111 | 0 |
| 0.9118055555555555 | 0 |
| 0.9125 | 0 |
| 0.9131944444444445 | 0 |
| 0.9138888888888889 | 0 |
| 0.9145833333333333 | 0 |
| 0.9152777777777777 | 0 |
| 0.9159722222222223 | 0 |
| 0.9166666666666666 | 0 |
| 0.9173611111111111 | 0 |
| 0.9180555555555556 | 0 |
| 0.9187500000000001 | 0 |
| 0.9194444444444444 | 0 |
| 0.9201388888888888 | 0 |
| 0.9208333333333334 | 0 |
| 0.9215277777777778 | 0 |
| 0.9222222222222222 | 0 |
| 0.9229166666666666 | 0 |
| 0.9236111111111112 | 0 |
| 0.9243055555555556 | 0 |
| 0.9249999999999999 | 0 |
| 0.9256944444444444 | 0 |
| 0.9263888888888889 | 0 |
| 0.9270833333333334 | 0 |
| 0.9277777777777777 | 0 |
| 0.9284722222222223 | 0 |
| 0.9291666666666667 | 0 |
| 0.9298611111111111 | 0 |
| 0.9305555555555555 | 0 |
| 0.93125 | 0 |
| 0.9319444444444445 | 0 |
| 0.9326388888888889 | 0 |
| 0.9333333333333332 | 0 |
| 0.9340277777777778 | 0 |
| 0.9347222222222222 | 0 |
| 0.9354166666666667 | 0 |
| 0.936111111111111 | 0 |
| 0.9368055555555556 | 0 |
| 0.9375 | 0 |
| 0.9381944444444444 | 0 |
| 0.938888888888889 | 0 |
| 0.9395833333333333 | 0 |
| 0.9402777777777778 | 0 |
| 0.9409722222222222 | 0 |
| 0.9416666666666668 | 0 |
| 0.9423611111111111 | 0 |
| 0.9430555555555555 | 0 |
| 0.94375 | 0 |
| 0.9444444444444445 | 0 |
| 0.9451388888888889 | 0 |
| 0.9458333333333333 | 0 |
| 0.9465277777777777 | 0 |
| 0.9472222222222223 | 0 |
| 0.9479166666666666 | 0 |
| 0.9486111111111111 | 0 |
| 0.9493055555555556 | 0 |
| 0.9500000000000001 | 0 |
| 0.9506944444444444 | 0 |
| 0.9513888888888888 | 0 |
| 0.9520833333333334 | 0 |
| 0.9527777777777778 | 0 |
| 0.9534722222222222 | 0 |
| 0.9541666666666666 | 0 |
| 0.9548611111111112 | 0 |
| 0.9555555555555556 | 0 |
| 0.9562499999999999 | 0 |
| 0.9569444444444444 | 0 |
| 0.9576388888888889 | 0 |
| 0.9583333333333334 | 0 |
| 0.9590277777777777 | 0 |
| 0.9597222222222223 | 0 |
| 0.9604166666666667 | 0 |
| 0.9611111111111111 | 0 |
| 0.9618055555555555 | 0 |
| 0.9625 | 0 |
| 0.9631944444444445 | 0 |
| 0.9638888888888889 | 0 |
| 0.9645833333333332 | 0 |
| 0.9652777777777778 | 0 |
| 0.9659722222222222 | 0 |
| 0.9666666666666667 | 0 |
| 0.967361111111111 | 0 |
| 0.9680555555555556 | 0 |
| 0.96875 | 0 |
| 0.9694444444444444 | 0 |
| 0.970138888888889 | 0 |
| 0.9708333333333333 | 0 |
| 0.9715277777777778 | 0 |
| 0.9722222222222222 | 0 |
| 0.9729166666666668 | 0 |
| 0.9736111111111111 | 0 |
| 0.9743055555555555 | 0 |
| 0.975 | 0 |
| 0.9756944444444445 | 0 |
| 0.9763888888888889 | 0 |
| 0.9770833333333333 | 0 |
| 0.9777777777777777 | 0 |
| 0.9784722222222223 | 0 |
| 0.9791666666666666 | 0 |
| 0.9798611111111111 | 0 |
| 0.9805555555555556 | 0 |
| 0.9812500000000001 | 0 |
| 0.9819444444444444 | 0 |
| 0.9826388888888888 | 0 |
| 0.9833333333333334 | 0 |
| 0.9840277777777778 | 0 |
| 0.9847222222222222 | 0 |
| 0.9854166666666666 | 0 |
| 0.9861111111111112 | 0 |
| 0.9868055555555556 | 0 |
| 0.9874999999999999 | 0 |
| 0.9881944444444444 | 0 |
| 0.9888888888888889 | 0 |
| 0.9895833333333334 | 0 |
| 0.9902777777777777 | 0 |
| 0.9909722222222223 | 0 |
| 0.9916666666666667 | 0 |
| 0.9923611111111111 | 0 |
| 0.9930555555555555 | 0 |
| 0.99375 | 0 |
| 0.9944444444444445 | 0 |
| 0.9951388888888889 | 0 |
| 0.9958333333333332 | 0 |
| 0.9965277777777778 | 0 |
| 0.9972222222222222 | 0 |
| 0.9979166666666667 | 0 |
| 0.998611111111111 | 0 |
| 0.9993055555555556 | 0 |